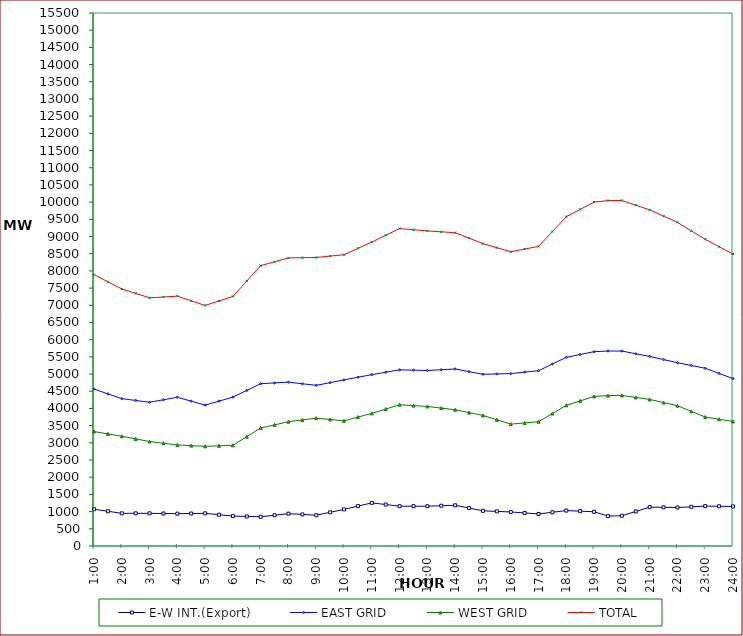
| Category | E-W INT.(Export) | EAST GRID | WEST GRID | TOTAL |
|---|---|---|---|---|
| 1:00 | 1070 | 4564 | 3329 | 7893 |
| 1:30 | 1010 | 4424.5 | 3260 | 7684.5 |
| 2:00 | 950 | 4285 | 3191 | 7476 |
| 2:30 | 950 | 4232.5 | 3114.5 | 7347 |
| 3:00 | 950 | 4180 | 3038 | 7218 |
| 3:30 | 945 | 4253 | 2988.5 | 7241.5 |
| 4:00 | 940 | 4326 | 2939 | 7265 |
| 4:30 | 945 | 4211.5 | 2919 | 7130.5 |
| 5:00 | 950 | 4097 | 2899 | 6996 |
| 5:30 | 910 | 4213.5 | 2913.5 | 7127 |
| 6:00 | 870 | 4330 | 2928 | 7258 |
| 6:30 | 860 | 4525.5 | 3180 | 7705.5 |
| 7:00 | 850 | 4721 | 3432 | 8153 |
| 7:30 | 895 | 4742.5 | 3523.5 | 8266 |
| 8:00 | 940 | 4764 | 3615 | 8379 |
| 8:30 | 917.5 | 4718 | 3666.5 | 8384.5 |
| 9:00 | 895 | 4672 | 3718 | 8390 |
| 9:30 | 980 | 4751.5 | 3679 | 8430.5 |
| 10:00 | 1065 | 4831 | 3640 | 8471 |
| 10:30 | 1159.5 | 4907 | 3748.5 | 8655.5 |
| 11:00 | 1254 | 4983 | 3857 | 8840 |
| 11:30 | 1205.5 | 5053 | 3982.5 | 9035.5 |
| 12:00 | 1157 | 5123 | 4108 | 9231 |
| 12:30 | 1157 | 5113.5 | 4083.5 | 9197 |
| 13:00 | 1157 | 5104 | 4059 | 9163 |
| 13:30 | 1170.5 | 5126 | 4010.5 | 9136.5 |
| 14:00 | 1184 | 5148 | 3962 | 9110 |
| 14:30 | 1103.5 | 5071 | 3880 | 8951 |
| 15:00 | 1023 | 4994 | 3798 | 8792 |
| 15:30 | 1006.5 | 5004 | 3671 | 8675 |
| 16:00 | 990 | 5014 | 3544 | 8558 |
| 16:30 | 961 | 5056 | 3579.5 | 8635.5 |
| 17:00 | 932 | 5098 | 3615 | 8713 |
| 17:30 | 981 | 5292 | 3853 | 9145 |
| 18:00 | 1030 | 5486 | 4091 | 9577 |
| 18:30 | 1013 | 5568.5 | 4220.5 | 9789 |
| 19:00 | 996 | 5651 | 4350 | 10001 |
| 19:30 | 870 | 5670 | 4374 | 10044 |
| 20:00 | 880 | 5669 | 4379 | 10048 |
| 20:30 | 1005 | 5591 | 4321 | 9912 |
| 21:00 | 1130 | 5513 | 4263 | 9776 |
| 21:30 | 1125 | 5422 | 4172 | 9594 |
| 22:00 | 1120 | 5331 | 4081 | 9412 |
| 22:30 | 1140 | 5250 | 3916 | 9166 |
| 23:00 | 1160 | 5169 | 3751 | 8920 |
| 23:30 | 1155 | 5018.5 | 3686 | 8704.5 |
| 24:00 | 1150 | 4868 | 3621 | 8489 |